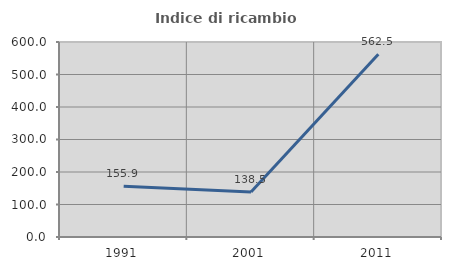
| Category | Indice di ricambio occupazionale  |
|---|---|
| 1991.0 | 155.882 |
| 2001.0 | 138.462 |
| 2011.0 | 562.5 |